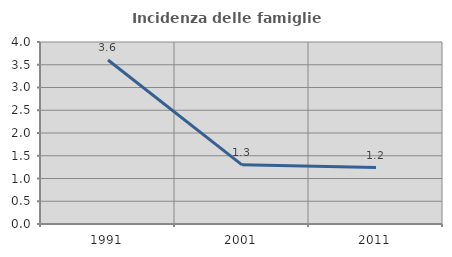
| Category | Incidenza delle famiglie numerose |
|---|---|
| 1991.0 | 3.604 |
| 2001.0 | 1.3 |
| 2011.0 | 1.24 |